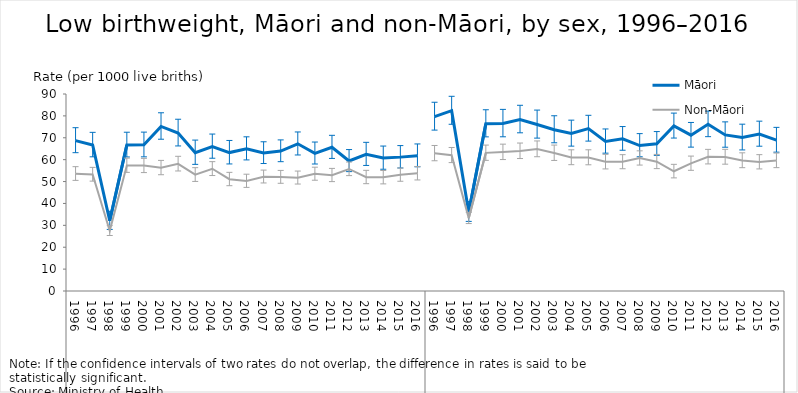
| Category | Māori | Non-Māori |
|---|---|---|
| 0 | 68.72 | 53.599 |
| 1 | 66.714 | 53.273 |
| 2 | 32.075 | 27.541 |
| 3 | 66.707 | 57.381 |
| 4 | 66.756 | 57.279 |
| 5 | 75.201 | 56.32 |
| 6 | 72.178 | 58.113 |
| 7 | 63.219 | 53.131 |
| 8 | 66.008 | 55.854 |
| 9 | 63.238 | 51.089 |
| 10 | 65.002 | 50.28 |
| 11 | 63.061 | 52.236 |
| 12 | 63.914 | 52.087 |
| 13 | 67.247 | 51.765 |
| 14 | 62.883 | 53.522 |
| 15 | 65.686 | 52.929 |
| 16 | 59.418 | 55.753 |
| 17 | 62.472 | 52.012 |
| 18 | 60.752 | 51.931 |
| 19 | 61.16 | 53.092 |
| 20 | 61.79 | 53.743 |
| 21 | 79.679 | 62.916 |
| 22 | 82.375 | 62.039 |
| 23 | 36.107 | 33.295 |
| 24 | 76.421 | 63.102 |
| 25 | 76.521 | 63.498 |
| 26 | 78.366 | 63.982 |
| 27 | 76.047 | 64.87 |
| 28 | 73.694 | 63.08 |
| 29 | 71.936 | 61.035 |
| 30 | 74.194 | 61.015 |
| 31 | 68.332 | 59.034 |
| 32 | 69.558 | 59.003 |
| 33 | 66.459 | 60.718 |
| 34 | 67.241 | 59.09 |
| 35 | 75.409 | 54.705 |
| 36 | 71.193 | 58.314 |
| 37 | 76.184 | 61.31 |
| 38 | 71.3 | 61.264 |
| 39 | 70.147 | 59.66 |
| 40 | 71.695 | 58.962 |
| 41 | 68.925 | 59.62 |